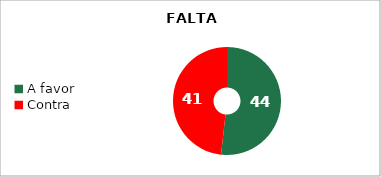
| Category | Series 1 |
|---|---|
| A favor | 44 |
| Contra | 41 |